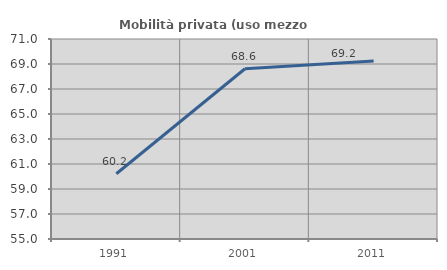
| Category | Mobilità privata (uso mezzo privato) |
|---|---|
| 1991.0 | 60.218 |
| 2001.0 | 68.621 |
| 2011.0 | 69.249 |